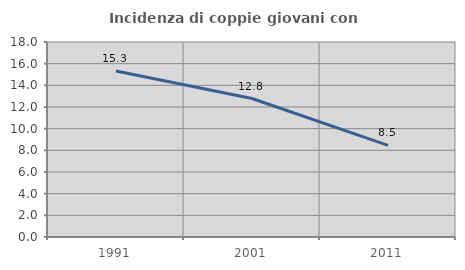
| Category | Incidenza di coppie giovani con figli |
|---|---|
| 1991.0 | 15.323 |
| 2001.0 | 12.782 |
| 2011.0 | 8.451 |